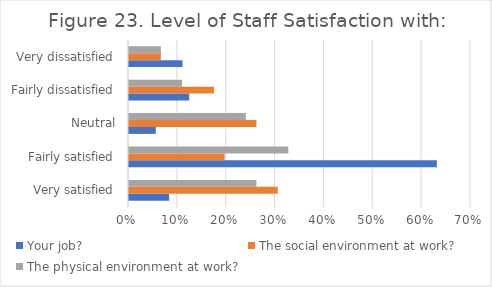
| Category | Your job? | The social environment at work? | The physical environment at work? |
|---|---|---|---|
| Very satisfied | 0.082 | 0.304 | 0.261 |
| Fairly satisfied | 0.63 | 0.196 | 0.326 |
| Neutral | 0.055 | 0.261 | 0.239 |
| Fairly dissatisfied | 0.123 | 0.174 | 0.109 |
| Very dissatisfied | 0.11 | 0.065 | 0.065 |